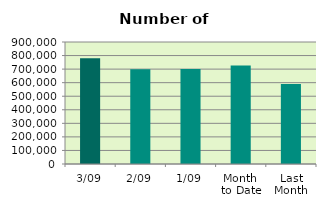
| Category | Series 0 |
|---|---|
| 3/09 | 779802 |
| 2/09 | 699466 |
| 1/09 | 700068 |
| Month 
to Date | 726445.333 |
| Last
Month | 590023.333 |